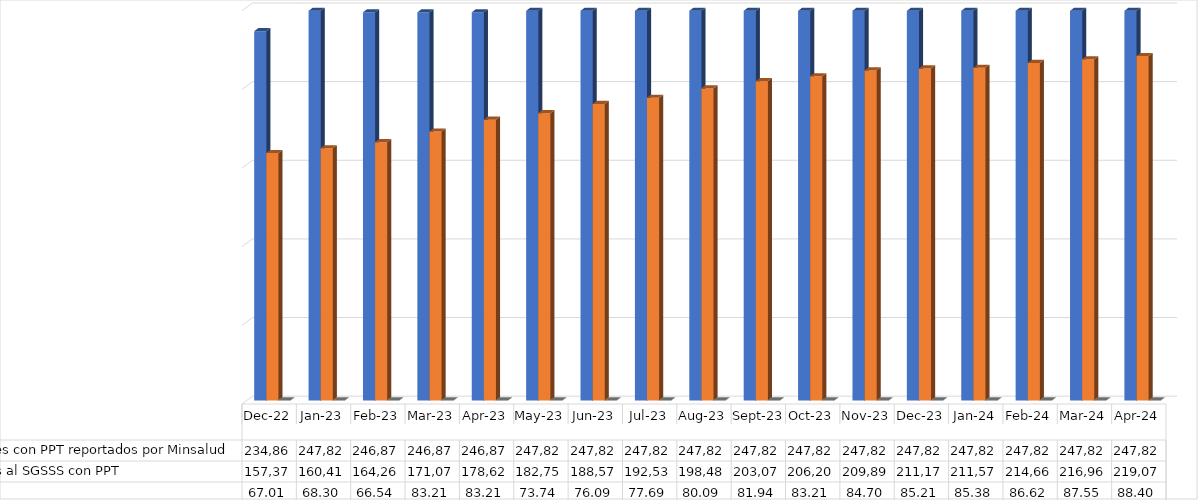
| Category | Nro de Migrantes con PPT reportados por Minsalud  | Nro de Afiliados al SGSSS con PPT | % Cobertura |
|---|---|---|---|
| 2022-12-01 | 234864 | 157372 | 67.006 |
| 2023-01-01 | 247821 | 160416 | 68.302 |
| 2023-02-01 | 246878 | 164261 | 66.535 |
| 2023-03-01 | 246878 | 171077 | 83.206 |
| 2023-04-01 | 246878 | 178625 | 83.206 |
| 2023-05-01 | 247821 | 182754 | 73.744 |
| 2023-06-01 | 247821 | 188578 | 76.094 |
| 2023-07-01 | 247821 | 192533 | 77.69 |
| 2023-08-01 | 247821 | 198485 | 80.092 |
| 2023-09-01 | 247821 | 203073 | 81.943 |
| 2023-10-01 | 247821 | 206201 | 83.206 |
| 2023-11-01 | 247821 | 209898 | 84.697 |
| 2023-12-01 | 247821 | 211175 | 85.213 |
| 2024-01-01 | 247821 | 211578 | 85.375 |
| 2024-02-01 | 247821 | 214661 | 86.619 |
| 2024-03-01 | 247821 | 216961 | 87.547 |
| 2024-04-01 | 247821 | 219072 | 88.399 |